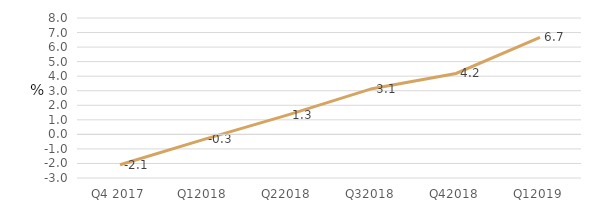
| Category | Series 0 |
|---|---|
| Q4 2017 | -2.089 |
| Q12018 | -0.348 |
| Q22018 | 1.343 |
| Q32018 | 3.142 |
| Q42018 | 4.189 |
| Q12019 | 6.662 |